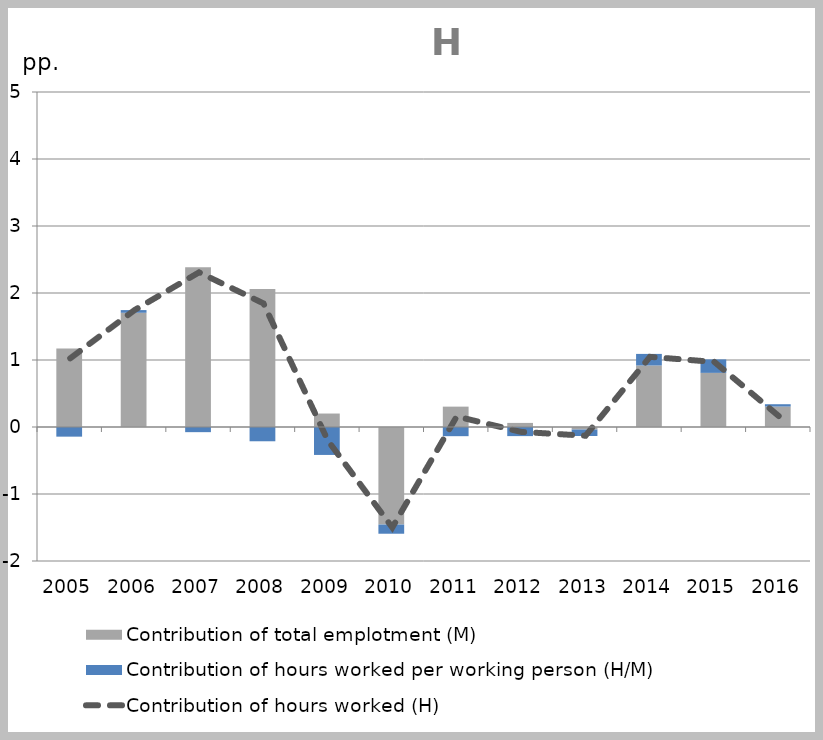
| Category | Contribution of total emplotment (M) | Contribution of hours worked per working person (H/M) |
|---|---|---|
| 2005.0 | 1.17 | -0.144 |
| 2006.0 | 1.705 | 0.04 |
| 2007.0 | 2.385 | -0.077 |
| 2008.0 | 2.058 | -0.213 |
| 2009.0 | 0.201 | -0.417 |
| 2010.0 | -1.456 | -0.137 |
| 2011.0 | 0.304 | -0.137 |
| 2012.0 | 0.061 | -0.136 |
| 2013.0 | -0.038 | -0.096 |
| 2014.0 | 0.918 | 0.173 |
| 2015.0 | 0.808 | 0.201 |
| 2016.0 | 0.305 | 0.035 |